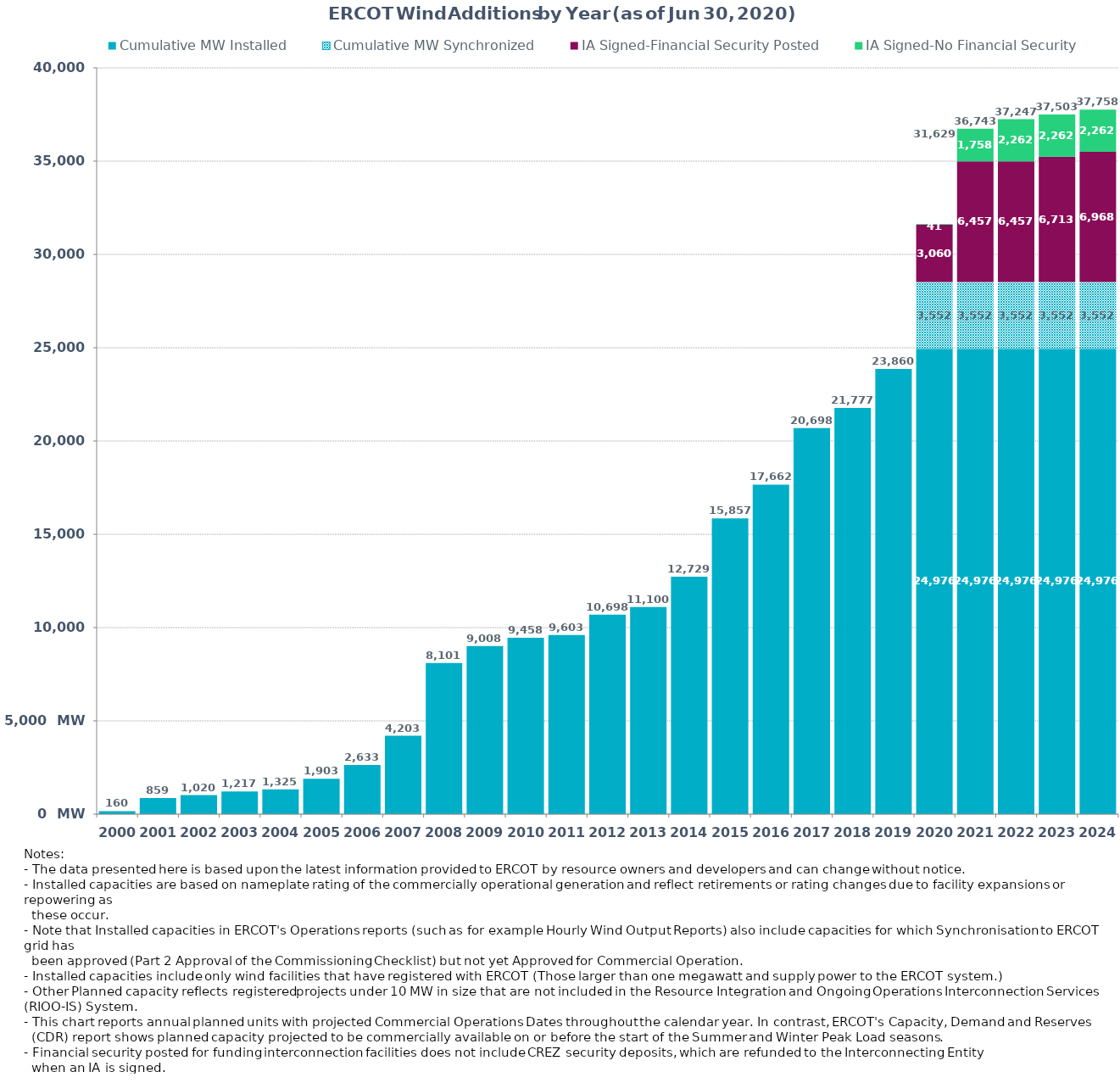
| Category | Cumulative MW Installed | Cumulative MW Synchronized | IA Signed-Financial Security Posted  | IA Signed-No Financial Security  | Other Planned | Cumulative Installed and Planned |
|---|---|---|---|---|---|---|
| 2000.0 | 160.37 | 0 | 0 | 0 | 0 | 160.37 |
| 2001.0 | 859.29 | 0 | 0 | 0 | 0 | 859.29 |
| 2002.0 | 1019.79 | 0 | 0 | 0 | 0 | 1019.79 |
| 2003.0 | 1217.29 | 0 | 0 | 0 | 0 | 1217.29 |
| 2004.0 | 1325.29 | 0 | 0 | 0 | 0 | 1325.29 |
| 2005.0 | 1902.69 | 0 | 0 | 0 | 0 | 1902.69 |
| 2006.0 | 2633.39 | 0 | 0 | 0 | 0 | 2633.39 |
| 2007.0 | 4203.41 | 0 | 0 | 0 | 0 | 4203.41 |
| 2008.0 | 8101.01 | 0 | 0 | 0 | 0 | 8101.01 |
| 2009.0 | 9007.57 | 0 | 0 | 0 | 0 | 9007.57 |
| 2010.0 | 9458.49 | 0 | 0 | 0 | 0 | 9458.49 |
| 2011.0 | 9603.49 | 0 | 0 | 0 | 0 | 9603.49 |
| 2012.0 | 10698.35 | 0 | 0 | 0 | 0 | 10698.35 |
| 2013.0 | 11100.05 | 0 | 0 | 0 | 0 | 11100.05 |
| 2014.0 | 12728.93 | 0 | 0 | 0 | 0 | 12728.93 |
| 2015.0 | 15857.48 | 0 | 0 | 0 | 0 | 15857.48 |
| 2016.0 | 17662.45 | 0 | 0 | 0 | 0 | 17662.45 |
| 2017.0 | 20697.84 | 0 | 0 | 0 | 0 | 20697.84 |
| 2018.0 | 21777 | 0 | 0 | 0 | 0 | 21777 |
| 2019.0 | 23860 | 0 | 0 | 0 | 0 | 23860 |
| 2020.0 | 24976 | 3552 | 3059.6 | 41 | 0 | 31628.6 |
| 2021.0 | 24975.68 | 3552 | 6457.28 | 1758.22 | 0 | 36743.18 |
| 2022.0 | 24975.68 | 3552 | 6457.28 | 2262.22 | 0 | 37247.18 |
| 2023.0 | 24975.68 | 3552 | 6713 | 2262.22 | 0 | 37502.9 |
| 2024.0 | 24975.68 | 3552 | 6967.88 | 2262.22 | 0 | 37757.78 |